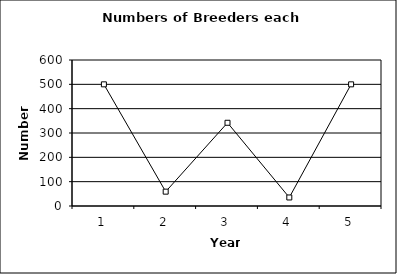
| Category | Series 1 |
|---|---|
| 0 | 500 |
| 1 | 59 |
| 2 | 342 |
| 3 | 35 |
| 4 | 500 |